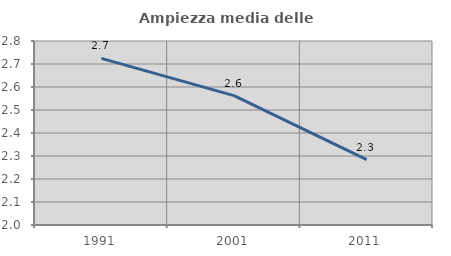
| Category | Ampiezza media delle famiglie |
|---|---|
| 1991.0 | 2.725 |
| 2001.0 | 2.562 |
| 2011.0 | 2.284 |